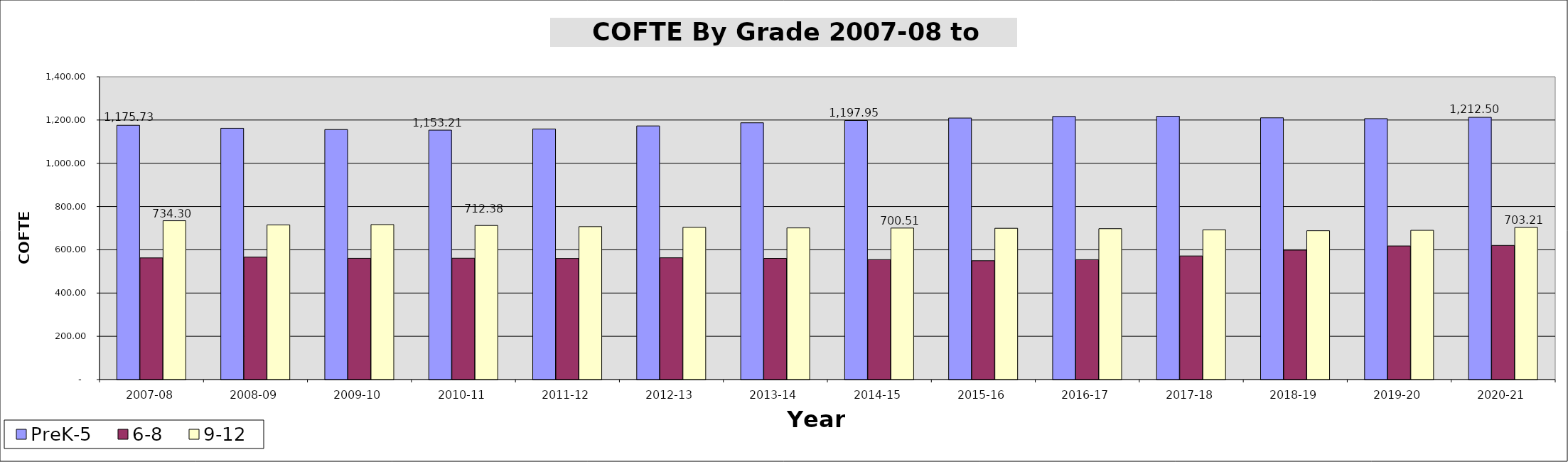
| Category | PreK-5 | 6-8 | 9-12 |
|---|---|---|---|
| 2007-08 | 1175733.92 | 562511 | 734300.16 |
| 2008-09 | 1161919.54 | 566064.98 | 714999.98 |
| 2009-10 | 1155893.43 | 560636.3 | 716499.19 |
| 2010-11 | 1153213.28 | 561090.94 | 712381.12 |
| 2011-12 | 1158532.28 | 559905.77 | 707104.92 |
| 2012-13 | 1172690.71 | 563021.91 | 703756.44 |
| 2013-14 | 1187222.62 | 560314.96 | 701114.69 |
| 2014-15 | 1197948.49 | 554336.06 | 700506.93 |
| 2015-16 | 1209156.14 | 549486.87 | 699431.76 |
| 2016-17 | 1216566.38 | 554086.91 | 697539.72 |
| 2017-18 | 1217600.6 | 571413.28 | 692267.24 |
| 2018-19 | 1210164.69 | 598278.24 | 688085.54 |
| 2019-20 | 1206315.07 | 617677.75 | 689944.03 |
| 2020-21 | 1212503.01 | 620107.08 | 703210.11 |